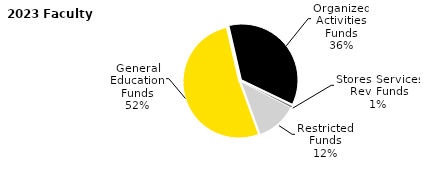
| Category | Series 0 |
|---|---|
| General Education Funds | 1421.003 |
| Organized Activities Funds | 978.041 |
| Stores Services Rev Funds | 15.401 |
| Restricted Funds | 320.879 |